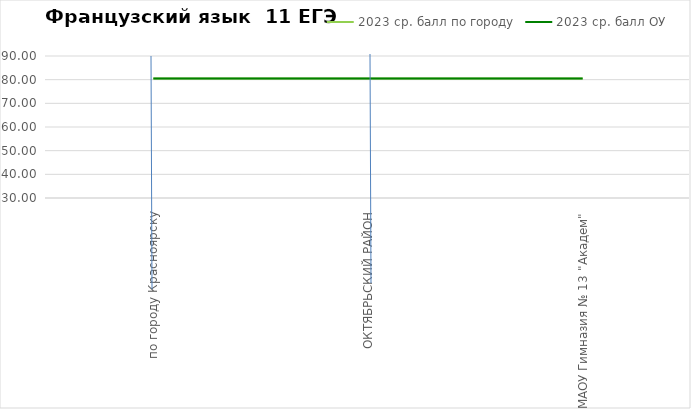
| Category | 2023 ср. балл по городу | 2023 ср. балл ОУ |
|---|---|---|
| по городу Красноярску | 80.5 | 80.5 |
| ОКТЯБРЬСКИЙ РАЙОН | 80.5 | 80.5 |
| МАОУ Гимназия № 13 "Академ" | 80.5 | 80.5 |